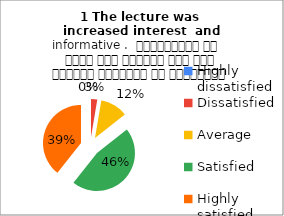
| Category | 1 The lecture was  increased interest  and informative .  व्याख्यान से रुचि में वृद्धि हुई एवं शिक्षण जानकारी से परिपूर्ण था |
|---|---|
| Highly dissatisfied | 0 |
| Dissatisfied | 5 |
| Average | 22 |
| Satisfied | 87 |
| Highly satisfied | 74 |